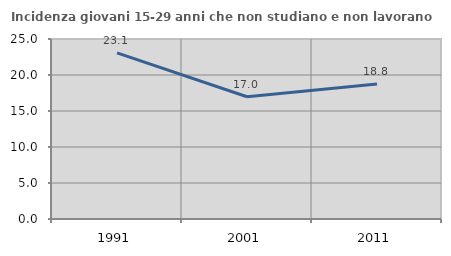
| Category | Incidenza giovani 15-29 anni che non studiano e non lavorano  |
|---|---|
| 1991.0 | 23.077 |
| 2001.0 | 16.979 |
| 2011.0 | 18.758 |